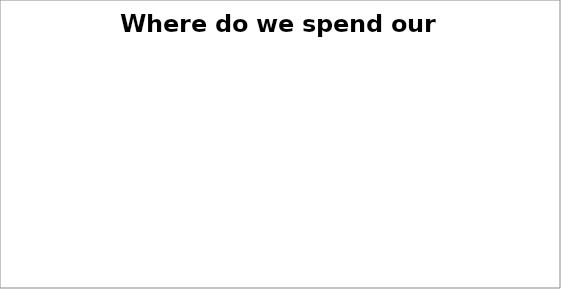
| Category | Series 0 |
|---|---|
| Administration | 0 |
| Operations | 0 |
| Game Development | 0 |
| Bar/shop | 0 |
| Representative | 0 |
| Tournaments | 0 |